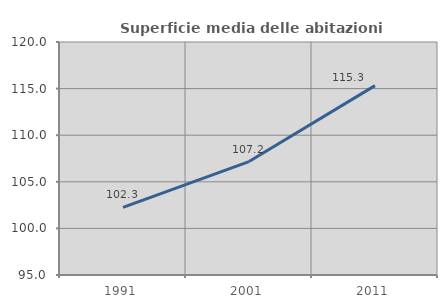
| Category | Superficie media delle abitazioni occupate |
|---|---|
| 1991.0 | 102.251 |
| 2001.0 | 107.171 |
| 2011.0 | 115.321 |